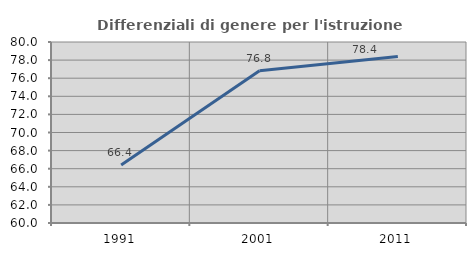
| Category | Differenziali di genere per l'istruzione superiore |
|---|---|
| 1991.0 | 66.412 |
| 2001.0 | 76.831 |
| 2011.0 | 78.389 |